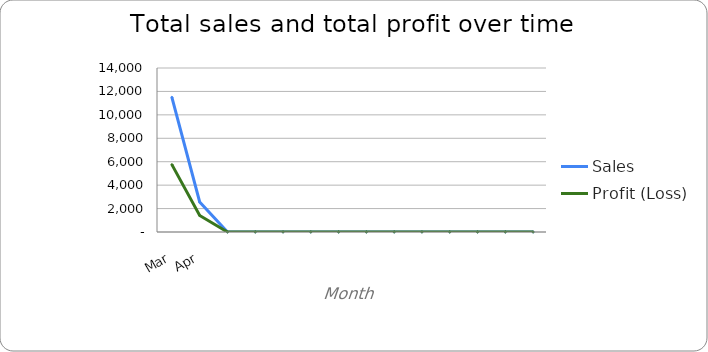
| Category | Sales  | Profit (Loss) |
|---|---|---|
| Mar | 11500 | 5750 |
| Apr | 2562 | 1411.64 |